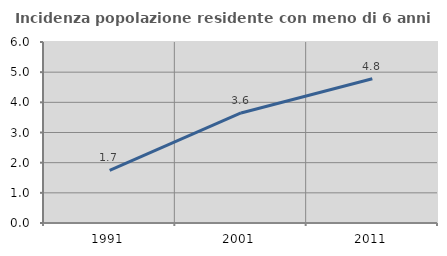
| Category | Incidenza popolazione residente con meno di 6 anni |
|---|---|
| 1991.0 | 1.748 |
| 2001.0 | 3.647 |
| 2011.0 | 4.78 |